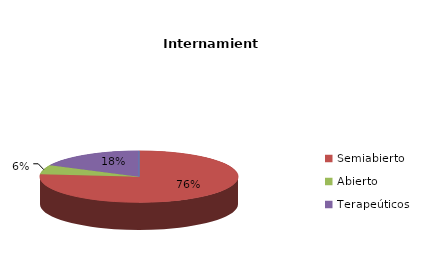
| Category | Series 0 |
|---|---|
| Cerrado | 0 |
| Semiabierto | 13 |
| Abierto | 1 |
| Terapeúticos | 3 |